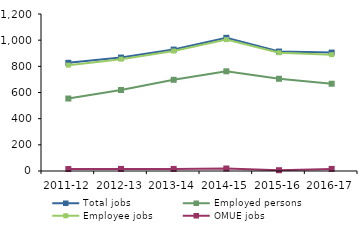
| Category | Total jobs | Employed persons | Employee jobs | OMUE jobs |
|---|---|---|---|---|
| 2011-12 | 827 | 554 | 809 | 15 |
| 2012-13 | 867 | 619 | 855 | 16 |
| 2013-14 | 928 | 697 | 917 | 16 |
| 2014-15 | 1018 | 762 | 1004 | 19 |
| 2015-16 | 913 | 705 | 904 | 6 |
| 2016-17 | 905 | 667 | 889 | 16 |